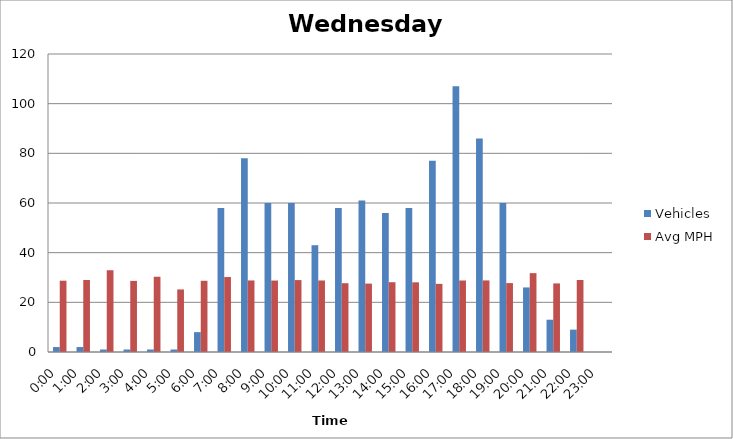
| Category | Vehicles | Avg MPH |
|---|---|---|
| 0:00 | 2 | 28.71 |
| 1:00 | 2 | 28.99 |
| 2:00 | 1 | 32.93 |
| 3:00 | 1 | 28.63 |
| 4:00 | 1 | 30.31 |
| 5:00 | 1 | 25.2 |
| 6:00 | 8 | 28.68 |
| 7:00 | 58 | 30.19 |
| 8:00 | 78 | 28.81 |
| 9:00 | 60 | 28.77 |
| 10:00 | 60 | 28.96 |
| 11:00 | 43 | 28.8 |
| 12:00 | 58 | 27.7 |
| 13:00 | 61 | 27.54 |
| 14:00 | 56 | 28.1 |
| 15:00 | 58 | 28.06 |
| 16:00 | 77 | 27.44 |
| 17:00 | 107 | 28.79 |
| 18:00 | 86 | 28.83 |
| 19:00 | 60 | 27.75 |
| 20:00 | 26 | 31.76 |
| 21:00 | 13 | 27.62 |
| 22:00 | 9 | 28.99 |
| 23:00 | 0 | 0 |